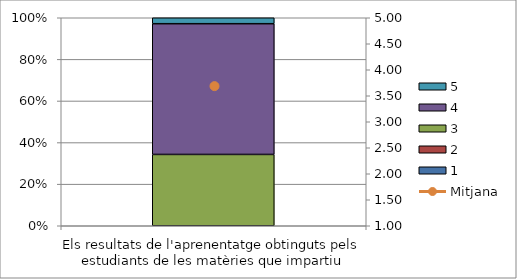
| Category | 1 | 2 | 3 | 4 | 5 |
|---|---|---|---|---|---|
| Els resultats de l'aprenentatge obtinguts pels estudiants de les matèries que impartiu | 0 | 0 | 12 | 22 | 1 |